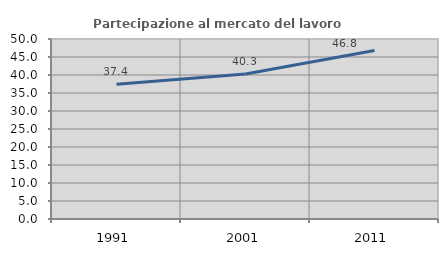
| Category | Partecipazione al mercato del lavoro  femminile |
|---|---|
| 1991.0 | 37.415 |
| 2001.0 | 40.286 |
| 2011.0 | 46.809 |